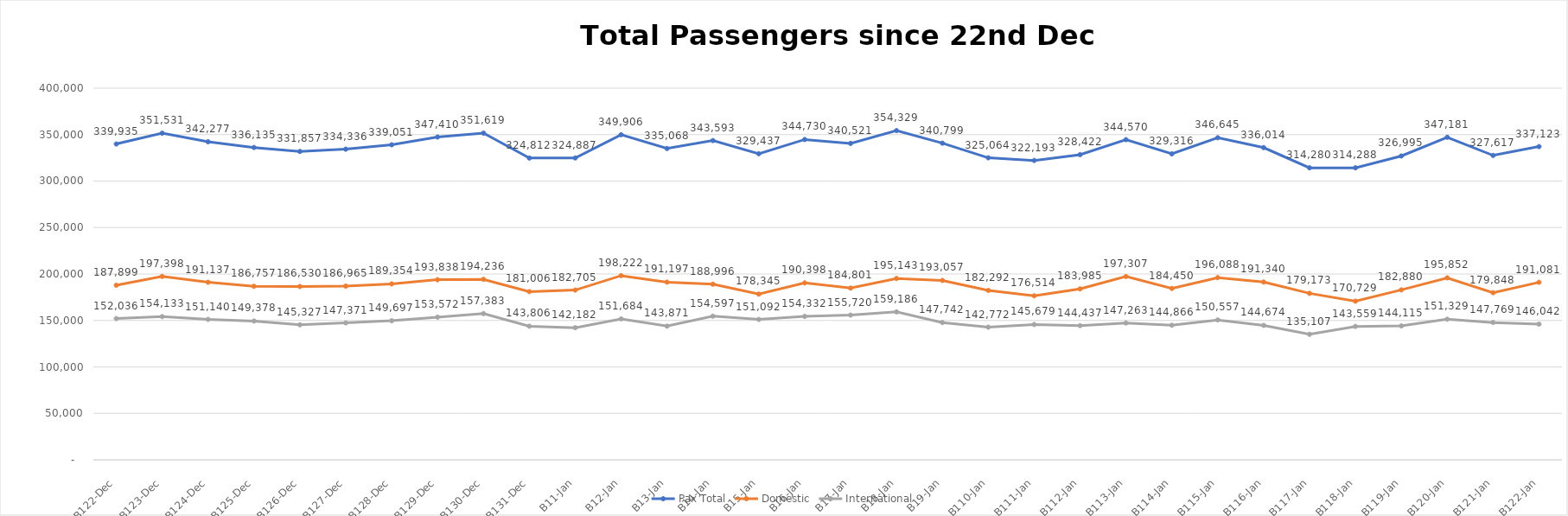
| Category | Pax Total |  Domestic  |  International  |
|---|---|---|---|
| 2022-12-22 | 339935 | 187899 | 152036 |
| 2022-12-23 | 351531 | 197398 | 154133 |
| 2022-12-24 | 342277 | 191137 | 151140 |
| 2022-12-25 | 336135 | 186757 | 149378 |
| 2022-12-26 | 331857 | 186530 | 145327 |
| 2022-12-27 | 334336 | 186965 | 147371 |
| 2022-12-28 | 339051 | 189354 | 149697 |
| 2022-12-29 | 347410 | 193838 | 153572 |
| 2022-12-30 | 351619 | 194236 | 157383 |
| 2022-12-31 | 324812 | 181006 | 143806 |
| 2023-01-01 | 324887 | 182705 | 142182 |
| 2023-01-02 | 349906 | 198222 | 151684 |
| 2023-01-03 | 335068 | 191197 | 143871 |
| 2023-01-04 | 343593 | 188996 | 154597 |
| 2023-01-05 | 329437 | 178345 | 151092 |
| 2023-01-06 | 344730 | 190398 | 154332 |
| 2023-01-07 | 340521 | 184801 | 155720 |
| 2023-01-08 | 354329 | 195143 | 159186 |
| 2023-01-09 | 340799 | 193057 | 147742 |
| 2023-01-10 | 325064 | 182292 | 142772 |
| 2023-01-11 | 322193 | 176514 | 145679 |
| 2023-01-12 | 328422 | 183985 | 144437 |
| 2023-01-13 | 344570 | 197307 | 147263 |
| 2023-01-14 | 329316 | 184450 | 144866 |
| 2023-01-15 | 346645 | 196088 | 150557 |
| 2023-01-16 | 336014 | 191340 | 144674 |
| 2023-01-17 | 314280 | 179173 | 135107 |
| 2023-01-18 | 314288 | 170729 | 143559 |
| 2023-01-19 | 326995 | 182880 | 144115 |
| 2023-01-20 | 347181 | 195852 | 151329 |
| 2023-01-21 | 327617 | 179848 | 147769 |
| 2023-01-22 | 337123 | 191081 | 146042 |